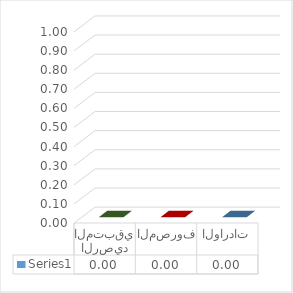
| Category | Series 0 |
|---|---|
| الواردات | 0 |
| المصروف | 0 |
| الرصيد المتبقي | 0 |